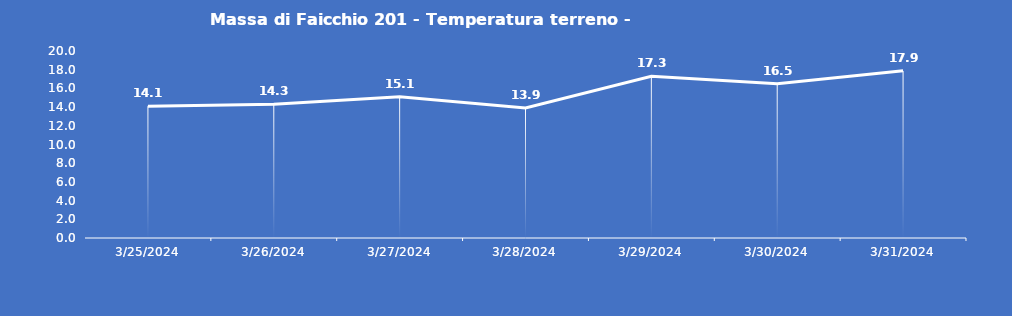
| Category | Massa di Faicchio 201 - Temperatura terreno - Grezzo (°C) |
|---|---|
| 3/25/24 | 14.1 |
| 3/26/24 | 14.3 |
| 3/27/24 | 15.1 |
| 3/28/24 | 13.9 |
| 3/29/24 | 17.3 |
| 3/30/24 | 16.5 |
| 3/31/24 | 17.9 |